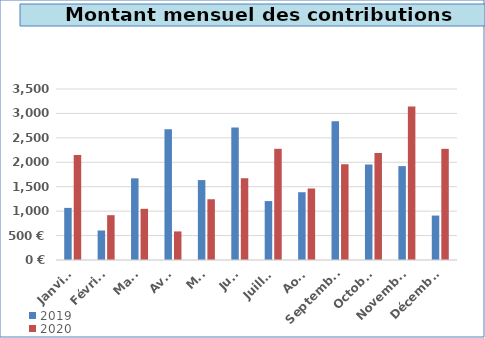
| Category | 2019 | 2020 |
|---|---|---|
| Janvier | 1066.94 | 2149.91 |
| Février | 603.76 | 917.41 |
| Mars | 1672.09 | 1047.76 |
| Avril | 2677.23 | 585 |
| Mai | 1635.43 | 1243.8 |
| Juin | 2710.4 | 1673.56 |
| Juillet | 1205.84 | 2275.63 |
| Août | 1387.25 | 1463.35 |
| Septembre | 2840.66 | 1959.98 |
| Octobre | 1952.8 | 2190.85 |
| Novembre | 1921.87 | 3139.7 |
| Décembre | 909.85 | 2275.2 |